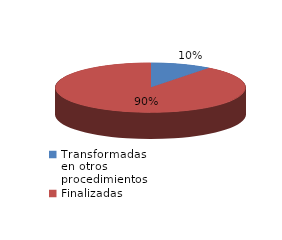
| Category | Series 0 |
|---|---|
| Transformadas en otros procedimientos | 8955 |
| Finalizadas | 77023 |